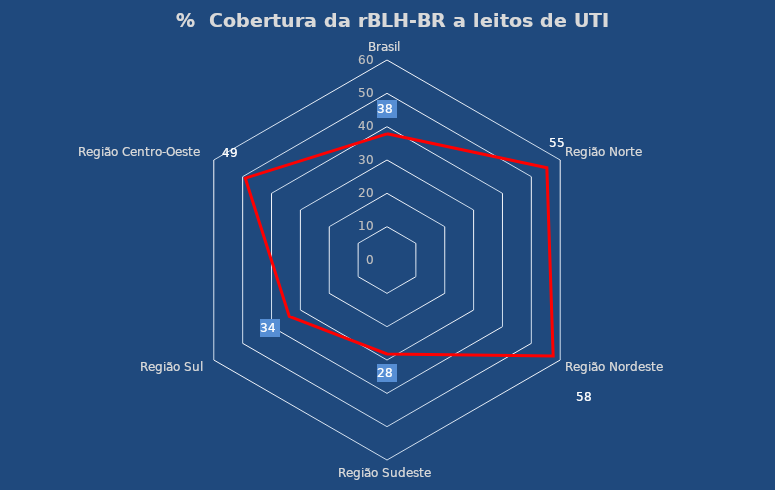
| Category | Cobertura % |
|---|---|
| Brasil | 37.849 |
| Região Norte | 55.373 |
| Região Nordeste | 57.562 |
| Região Sudeste | 28.165 |
| Região Sul | 33.848 |
| Região Centro-Oeste | 49.088 |